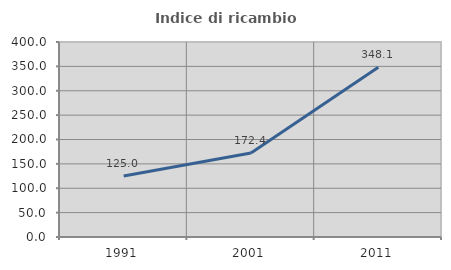
| Category | Indice di ricambio occupazionale  |
|---|---|
| 1991.0 | 125 |
| 2001.0 | 172.435 |
| 2011.0 | 348.068 |